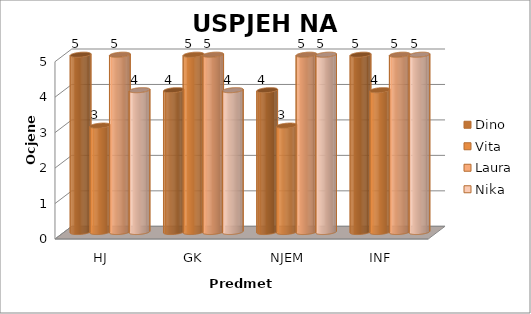
| Category | Dino | Vita | Laura | Nika |
|---|---|---|---|---|
| HJ | 5 | 3 | 5 | 4 |
| GK | 4 | 5 | 5 | 4 |
| NJEM | 4 | 3 | 5 | 5 |
| INF | 5 | 4 | 5 | 5 |